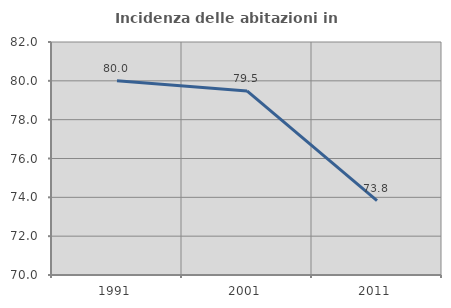
| Category | Incidenza delle abitazioni in proprietà  |
|---|---|
| 1991.0 | 80 |
| 2001.0 | 79.481 |
| 2011.0 | 73.828 |